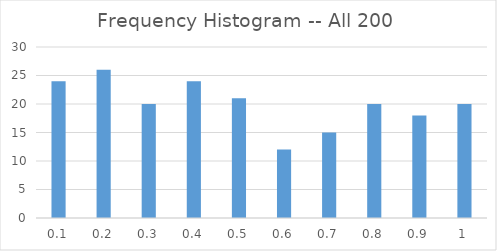
| Category | Series 0 |
|---|---|
| 0.1 | 24 |
| 0.2 | 26 |
| 0.3 | 20 |
| 0.4 | 24 |
| 0.5 | 21 |
| 0.6 | 12 |
| 0.7 | 15 |
| 0.8 | 20 |
| 0.9 | 18 |
| 1.0 | 20 |